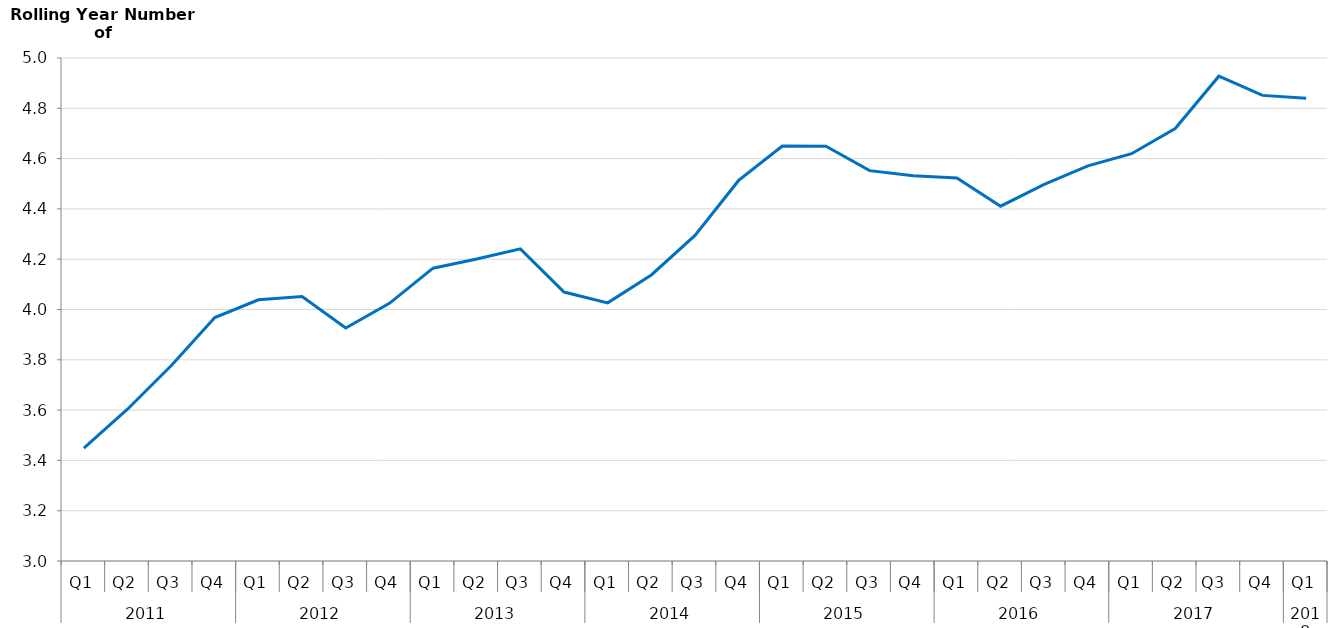
| Category | Rolling Year Overnight Trips  |
|---|---|
| 0 | 3449234.585 |
| 1 | 3603503.025 |
| 2 | 3776061.835 |
| 3 | 3967762.023 |
| 4 | 4038429.282 |
| 5 | 4051615.143 |
| 6 | 3926598.037 |
| 7 | 4024504.999 |
| 8 | 4164220.885 |
| 9 | 4200581.796 |
| 10 | 4241056.555 |
| 11 | 4069440.424 |
| 12 | 4026459.687 |
| 13 | 4137374.729 |
| 14 | 4294428.3 |
| 15 | 4513146.4 |
| 16 | 4649933.446 |
| 17 | 4649322.249 |
| 18 | 4552115.024 |
| 19 | 4531617.984 |
| 20 | 4522878.299 |
| 21 | 4410785.417 |
| 22 | 4497516.255 |
| 23 | 4571100.408 |
| 24 | 4619400.576 |
| 25 | 4719519.186 |
| 26 | 4927750.398 |
| 27 | 4851315.218 |
| 28 | 4840212.09 |